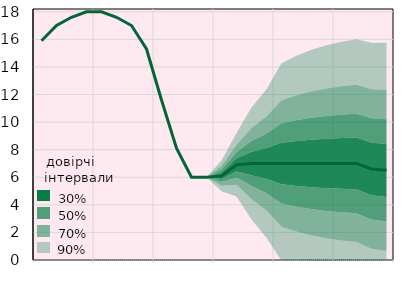
| Category | Облікова ставка, % |
|---|---|
|  | 15.9 |
|  | 17 |
|  | 17.6 |
| IV.18 | 18 |
|  | 18 |
|  | 17.6 |
|  | 17 |
| IV.19 | 15.3 |
|  | 11.6 |
|  | 8.1 |
|  | 6 |
| IV.20 | 6 |
|  | 6.1 |
|  | 6.9 |
|  | 7 |
| IV.21 | 7 |
|  | 7 |
|  | 7 |
|  | 7 |
| IV.22 | 7 |
|  | 7 |
|  | 7 |
|  | 6.6 |
| IV.23 | 6.5 |